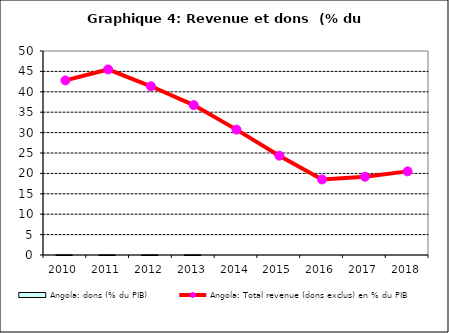
| Category | Angola: dons (% du PIB) |
|---|---|
| 2010.0 | 0.025 |
| 2011.0 | 0.019 |
| 2012.0 | 0.016 |
| 2013.0 | 0.026 |
| 2014.0 | 0 |
| 2015.0 | 0 |
| 2016.0 | 0 |
| 2017.0 | 0 |
| 2018.0 | 0 |